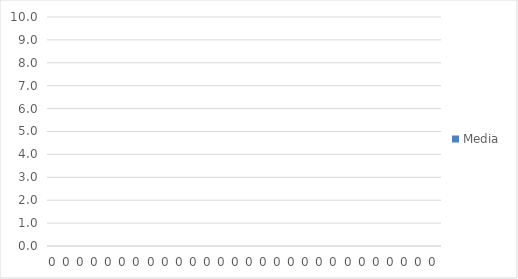
| Category | Media |
|---|---|
| 0.0 | 0 |
| 0.0 | 0 |
| 0.0 | 0 |
| 0.0 | 0 |
| 0.0 | 0 |
| 0.0 | 0 |
| 0.0 | 0 |
| 0.0 | 0 |
| 0.0 | 0 |
| 0.0 | 0 |
| 0.0 | 0 |
| 0.0 | 0 |
| 0.0 | 0 |
| 0.0 | 0 |
| 0.0 | 0 |
| 0.0 | 0 |
| 0.0 | 0 |
| 0.0 | 0 |
| 0.0 | 0 |
| 0.0 | 0 |
| 0.0 | 0 |
| 0.0 | 0 |
| 0.0 | 0 |
| 0.0 | 0 |
| 0.0 | 0 |
| 0.0 | 0 |
| 0.0 | 0 |
| 0.0 | 0 |